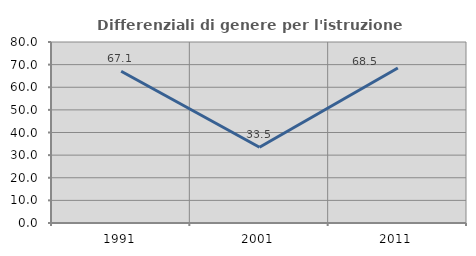
| Category | Differenziali di genere per l'istruzione superiore |
|---|---|
| 1991.0 | 67.089 |
| 2001.0 | 33.455 |
| 2011.0 | 68.478 |